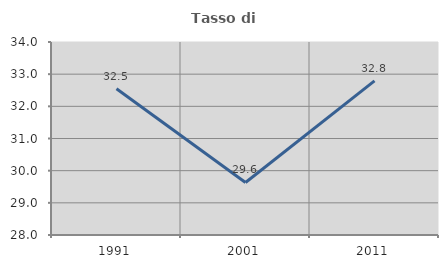
| Category | Tasso di occupazione   |
|---|---|
| 1991.0 | 32.547 |
| 2001.0 | 29.634 |
| 2011.0 | 32.791 |